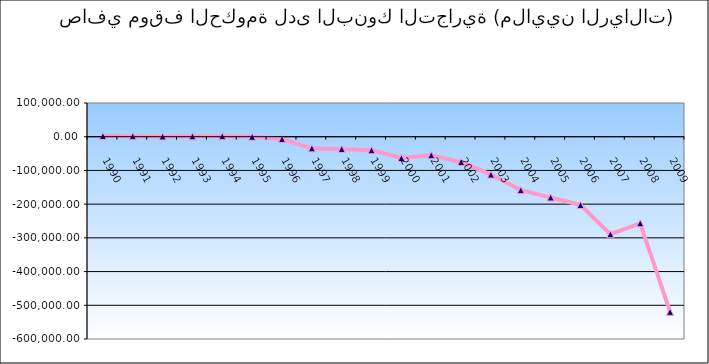
| Category | صافي الموقف لدى البنوك التجارية |
|---|---|
| 1990.0 | 2027.1 |
| 1991.0 | 1641.1 |
| 1992.0 | 919.2 |
| 1993.0 | 1262 |
| 1994.0 | 1527.5 |
| 1995.0 | -168.7 |
| 1996.0 | -6792.5 |
| 1997.0 | -34398.4 |
| 1998.0 | -36214.7 |
| 1999.0 | -39942 |
| 2000.0 | -63126.3 |
| 2001.0 | -54751.8 |
| 2002.0 | -75176.9 |
| 2003.0 | -112366.4 |
| 2004.0 | -158461.1 |
| 2005.0 | -180122.6 |
| 2006.0 | -202617 |
| 2007.0 | -289127.5 |
| 2008.0 | -256669.3 |
| 2009.0 | -519560.7 |